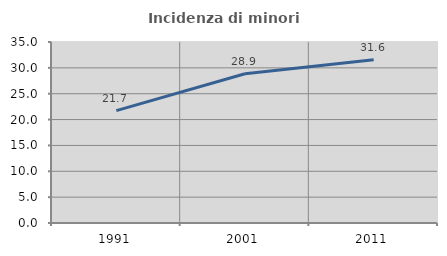
| Category | Incidenza di minori stranieri |
|---|---|
| 1991.0 | 21.739 |
| 2001.0 | 28.854 |
| 2011.0 | 31.579 |